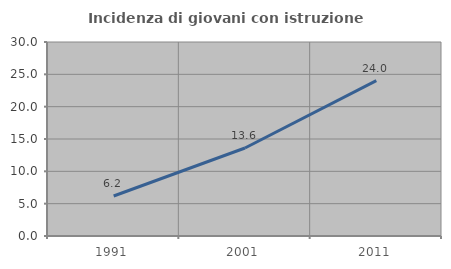
| Category | Incidenza di giovani con istruzione universitaria |
|---|---|
| 1991.0 | 6.183 |
| 2001.0 | 13.605 |
| 2011.0 | 24.017 |